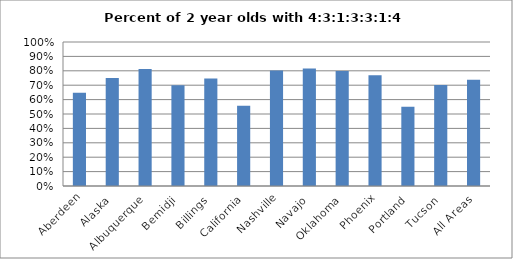
| Category | Percent with 4:3:1:3:3:1:4 |
|---|---|
| Aberdeen | 0.648 |
| Alaska | 0.751 |
| Albuquerque | 0.812 |
| Bemidji | 0.7 |
| Billings | 0.747 |
| California | 0.557 |
| Nashville | 0.802 |
| Navajo | 0.817 |
| Oklahoma | 0.799 |
| Phoenix | 0.77 |
| Portland | 0.55 |
| Tucson | 0.701 |
| All Areas | 0.738 |